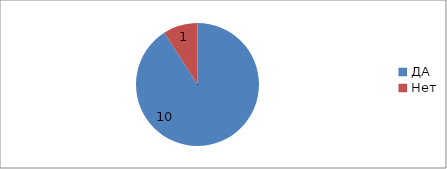
| Category | Series 0 |
|---|---|
| ДА | 10 |
| Нет | 1 |